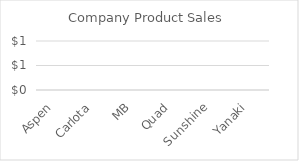
| Category | Company Product Sales |
|---|---|
| Aspen | 4521 |
| Carlota | 639.37 |
| MB | 4592.95 |
| Quad | 5280.52 |
| Sunshine | 3531.28 |
| Yanaki | 3076.94 |